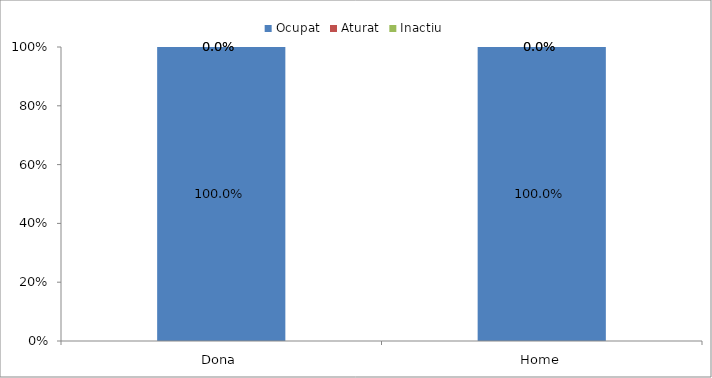
| Category | Ocupat | Aturat | Inactiu |
|---|---|---|---|
| Dona | 1 | 0 | 0 |
| Home | 1 | 0 | 0 |